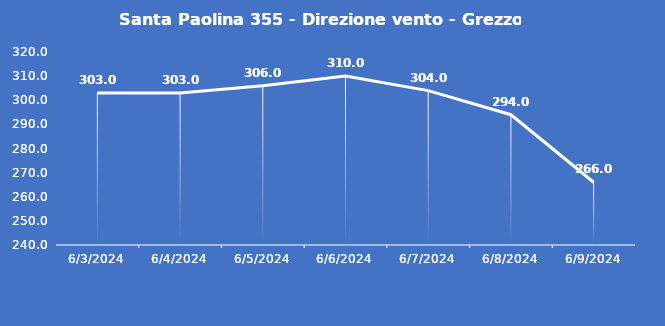
| Category | Santa Paolina 355 - Direzione vento - Grezzo (°N) |
|---|---|
| 6/3/24 | 303 |
| 6/4/24 | 303 |
| 6/5/24 | 306 |
| 6/6/24 | 310 |
| 6/7/24 | 304 |
| 6/8/24 | 294 |
| 6/9/24 | 266 |